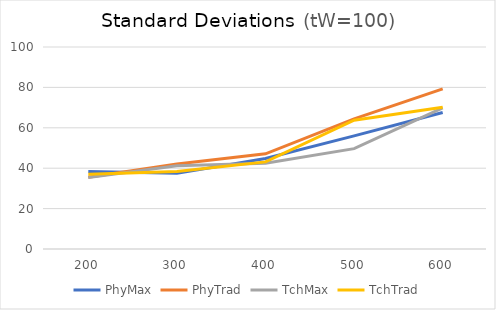
| Category | PhyMax | PhyTrad | TchMax | TchTrad |
|---|---|---|---|---|
| 200.0 | 38.35 | 35.552 | 35.359 | 36.957 |
| 300.0 | 37.44 | 42.127 | 41.22 | 38.374 |
| 400.0 | 44.786 | 47.142 | 42.429 | 43.129 |
| 500.0 | 55.993 | 64.439 | 49.682 | 63.792 |
| 600.0 | 67.565 | 79.262 | 69.893 | 70.216 |